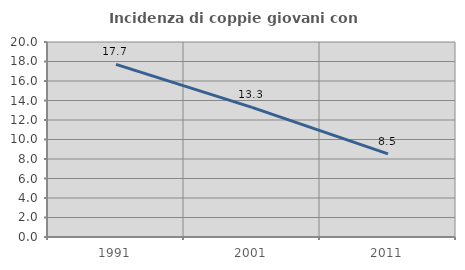
| Category | Incidenza di coppie giovani con figli |
|---|---|
| 1991.0 | 17.711 |
| 2001.0 | 13.299 |
| 2011.0 | 8.521 |